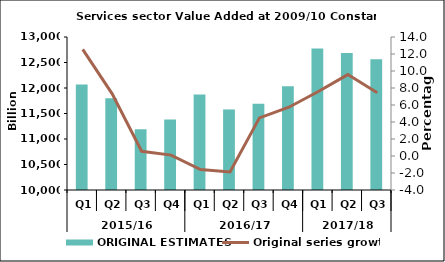
| Category | ORIGINAL ESTIMATES |
|---|---|
| 0 | 12066.888 |
| 1 | 11800.992 |
| 2 | 11190.867 |
| 3 | 11382.172 |
| 4 | 11874.703 |
| 5 | 11579.281 |
| 6 | 11693.012 |
| 7 | 12035.02 |
| 8 | 12776.343 |
| 9 | 12688.256 |
| 10 | 12563.07 |